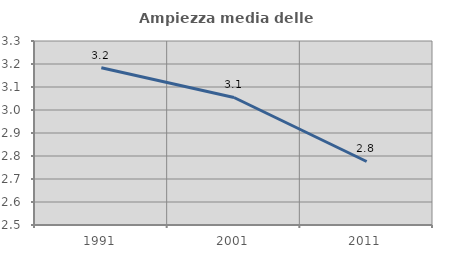
| Category | Ampiezza media delle famiglie |
|---|---|
| 1991.0 | 3.184 |
| 2001.0 | 3.054 |
| 2011.0 | 2.776 |